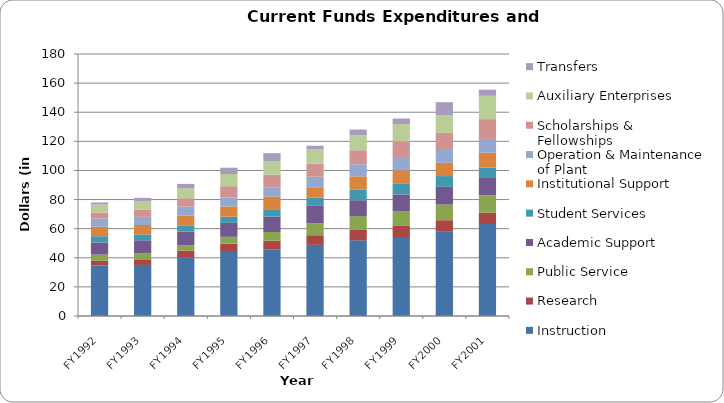
| Category | Instruction | Research | Public Service | Academic Support | Student Services | Institutional Support | Operation & Maintenance of Plant | Scholarships & Fellowships | Auxiliary Enterprises | Transfers |
|---|---|---|---|---|---|---|---|---|---|---|
| FY1992 | 34.639 | 3.288 | 4.237 | 8.263 | 4.371 | 6.549 | 5.634 | 4.069 | 5.574 | 1.377 |
| FY1993 | 35.068 | 3.86 | 4.031 | 9.077 | 3.998 | 6.481 | 5.596 | 4.808 | 5.76 | 2.48 |
| FY1994 | 40.108 | 4.842 | 3.502 | 9.493 | 4.365 | 6.686 | 6.199 | 5.741 | 6.871 | 2.933 |
| FY1995 | 43.989 | 5.741 | 4.656 | 9.608 | 4.247 | 7.024 | 6.227 | 7.656 | 8.426 | 4.302 |
| FY1996 | 45.897 | 5.851 | 5.961 | 10.527 | 5.135 | 8.701 | 6.443 | 8.599 | 9.264 | 5.487 |
| FY1997 | 48.886 | 6.591 | 8.205 | 12.349 | 5.423 | 6.976 | 7.259 | 8.988 | 9.706 | 2.561 |
| FY1998 | 51.974 | 7.14 | 9.52 | 10.917 | 7.147 | 9.243 | 8.311 | 9.631 | 10.383 | 3.865 |
| FY1999 | 54.239 | 8.007 | 9.836 | 11.447 | 7.628 | 8.991 | 8.355 | 11.558 | 11.845 | 3.795 |
| FY2000 | 58.148 | 7.668 | 10.736 | 12.179 | 7.402 | 9.091 | 8.869 | 11.676 | 12.269 | 8.862 |
| FY2001 | 63.183 | 7.791 | 11.97 | 11.848 | 7.252 | 10.092 | 9.533 | 13.59 | 16.024 | 4.213 |